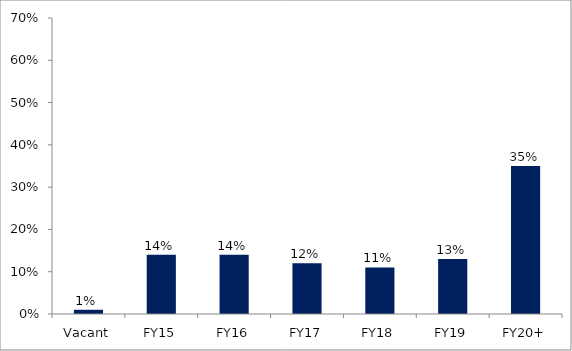
| Category | Series 0 |
|---|---|
| Vacant | 0.01 |
| FY15 | 0.14 |
| FY16 | 0.14 |
| FY17 | 0.12 |
| FY18 | 0.11 |
| FY19 | 0.13 |
| FY20+ | 0.35 |